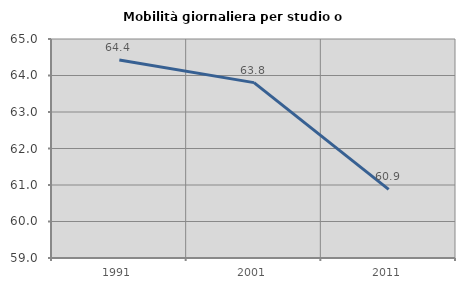
| Category | Mobilità giornaliera per studio o lavoro |
|---|---|
| 1991.0 | 64.425 |
| 2001.0 | 63.805 |
| 2011.0 | 60.88 |